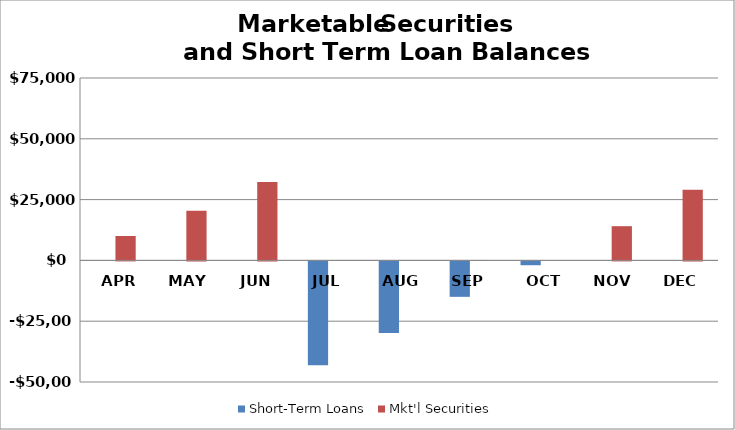
| Category | Short-Term Loans | Mkt'l Securities |
|---|---|---|
| APR | 0 | 10038.75 |
| MAY | 0 | 20445 |
| JUN | 0 | 32199.5 |
| JUL | -42739.5 | 0 |
| AUG | -29472 | 0 |
| SEP | -14569.5 | 0 |
| OCT | -1574.5 | 0 |
| NOV | 0 | 14068 |
| DEC | 0 | 29078 |